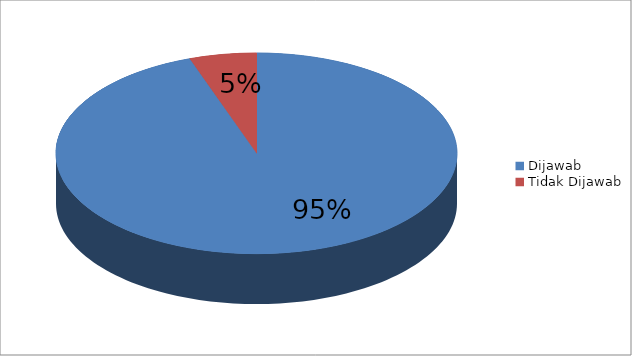
| Category | Series 0 |
|---|---|
| Dijawab | 70 |
| Tidak Dijawab | 4 |